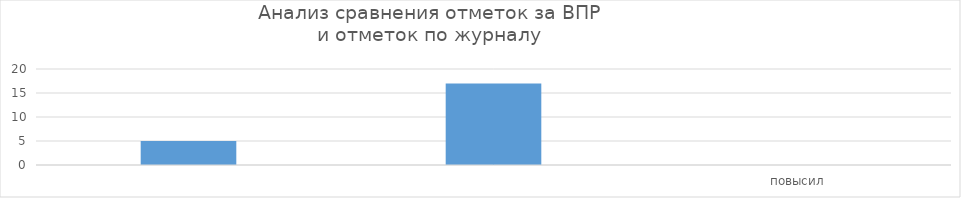
| Category | Series 0 |
|---|---|
|  | 5 |
|  | 17 |
| повысил | 0 |